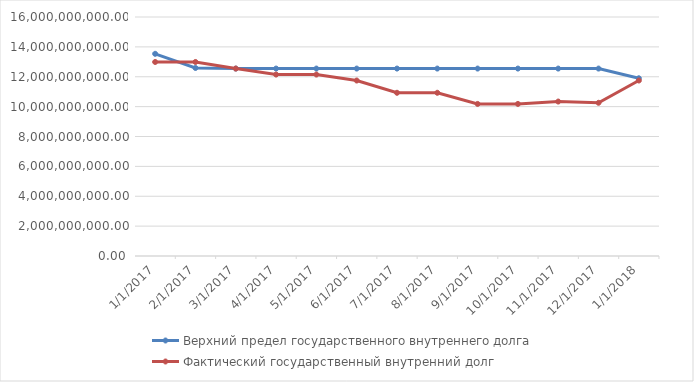
| Category | Верхний предел государственного внутреннего долга  | Фактический государственный внутренний долг |
|---|---|---|
| 1/1/17 | 13535744914.75 | 12988624913.78 |
| 2/1/17 | 12588150160 | 12988624913.78 |
| 3/1/17 | 12547650160 | 12547624913.78 |
| 4/1/17 | 12547650160 | 12147624913.78 |
| 5/1/17 | 12547650160 | 12147624913.78 |
| 6/1/17 | 12547650160 | 11747624913.78 |
| 7/1/17 | 12547650160 | 10927097555.78 |
| 8/1/17 | 12547650160 | 10927097555.78 |
| 9/1/17 | 12547650160 | 10180265555.78 |
| 10/1/17 | 12547650160 | 10180265555.78 |
| 11/1/17 | 12547650160 | 10340545555.78 |
| 12/1/17 | 12547650160 | 10256545555.78 |
| 1/1/18 | 11897650160 | 11747650159.78 |